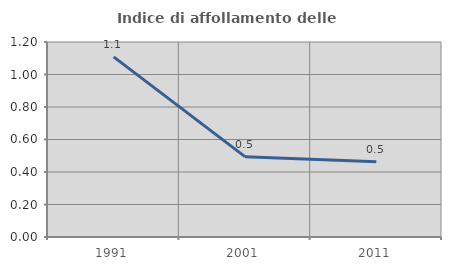
| Category | Indice di affollamento delle abitazioni  |
|---|---|
| 1991.0 | 1.108 |
| 2001.0 | 0.494 |
| 2011.0 | 0.462 |